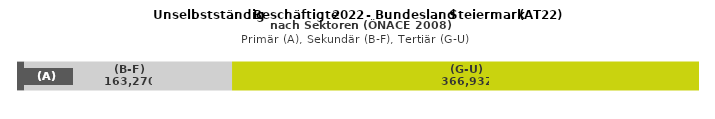
| Category | (A) | (B-F) | (G-U) |
|---|---|---|---|
| 0 | 5704 | 163270 | 366932 |